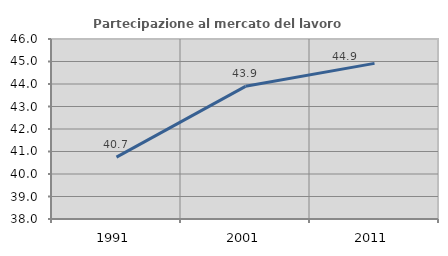
| Category | Partecipazione al mercato del lavoro  femminile |
|---|---|
| 1991.0 | 40.748 |
| 2001.0 | 43.897 |
| 2011.0 | 44.916 |